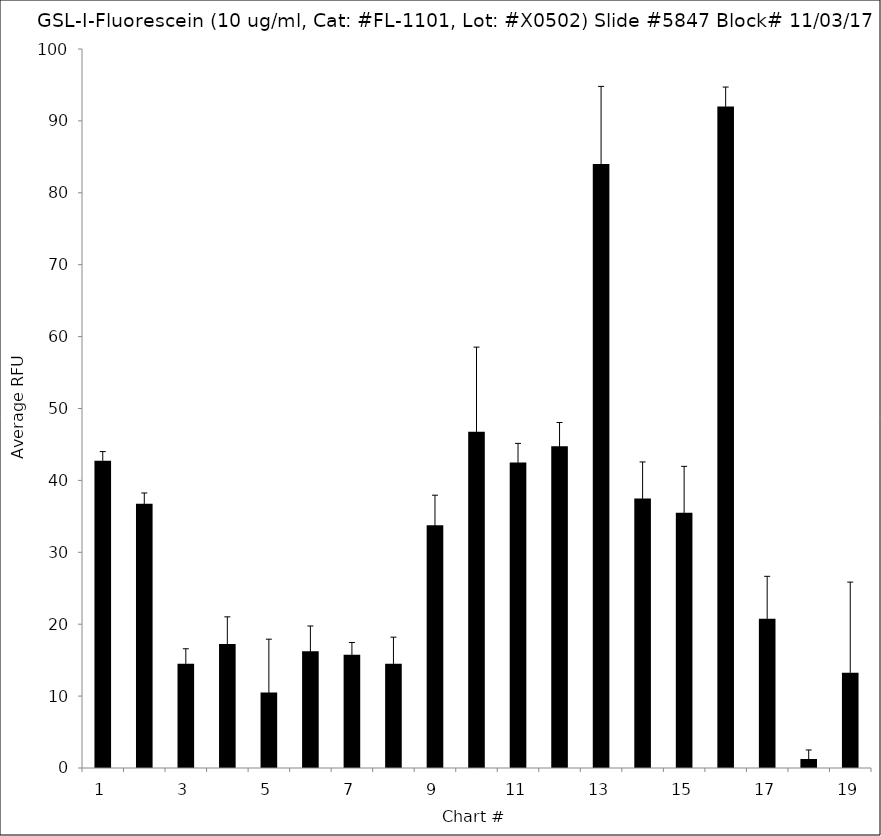
| Category | Series 0 |
|---|---|
| 1.0 | 42.75 |
| 2.0 | 36.75 |
| 3.0 | 14.5 |
| 4.0 | 17.25 |
| 5.0 | 10.5 |
| 6.0 | 16.25 |
| 7.0 | 15.75 |
| 8.0 | 14.5 |
| 9.0 | 33.75 |
| 10.0 | 46.75 |
| 11.0 | 42.5 |
| 12.0 | 44.75 |
| 13.0 | 84 |
| 14.0 | 37.5 |
| 15.0 | 35.5 |
| 16.0 | 92 |
| 17.0 | 20.75 |
| 18.0 | 1.25 |
| 19.0 | 13.25 |